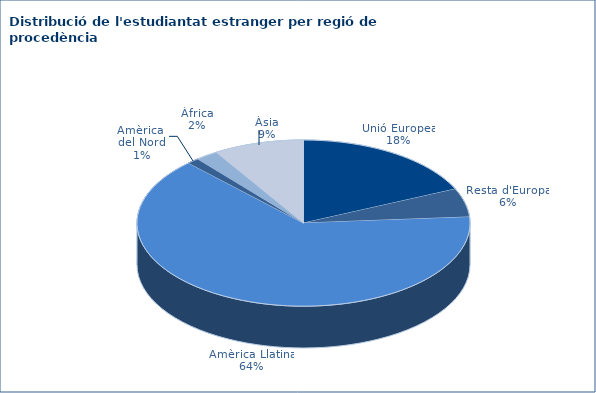
| Category | Series 0 |
|---|---|
| Unió Europea | 125 |
| Resta d'Europa | 38 |
| Amèrica Llatina | 438 |
| Amèrica del Nord | 8 |
| Àfrica | 15 |
| Àsia | 60 |